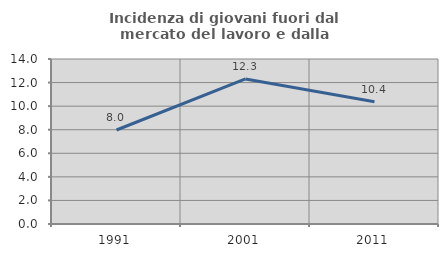
| Category | Incidenza di giovani fuori dal mercato del lavoro e dalla formazione  |
|---|---|
| 1991.0 | 7.974 |
| 2001.0 | 12.308 |
| 2011.0 | 10.376 |